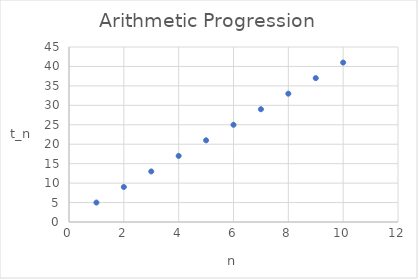
| Category | Series 0 |
|---|---|
| 1.0 | 5 |
| 2.0 | 9 |
| 3.0 | 13 |
| 4.0 | 17 |
| 5.0 | 21 |
| 6.0 | 25 |
| 7.0 | 29 |
| 8.0 | 33 |
| 9.0 | 37 |
| 10.0 | 41 |